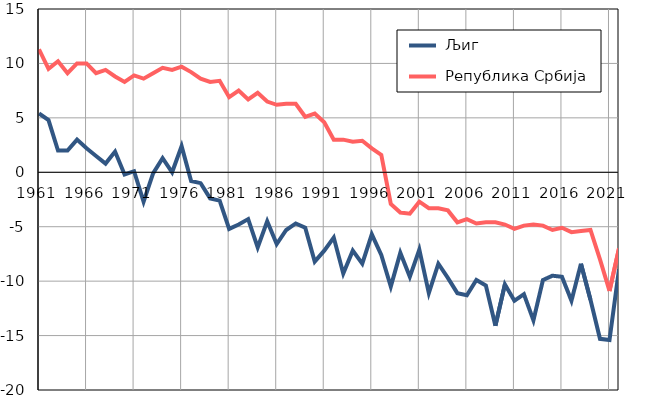
| Category |  Љиг |  Република Србија |
|---|---|---|
| 1961.0 | 5.4 | 11.3 |
| 1962.0 | 4.8 | 9.5 |
| 1963.0 | 2 | 10.2 |
| 1964.0 | 2 | 9.1 |
| 1965.0 | 3 | 10 |
| 1966.0 | 2.2 | 10 |
| 1967.0 | 1.5 | 9.1 |
| 1968.0 | 0.8 | 9.4 |
| 1969.0 | 1.9 | 8.8 |
| 1970.0 | -0.2 | 8.3 |
| 1971.0 | 0.1 | 8.9 |
| 1972.0 | -2.7 | 8.6 |
| 1973.0 | -0.1 | 9.1 |
| 1974.0 | 1.3 | 9.6 |
| 1975.0 | 0 | 9.4 |
| 1976.0 | 2.4 | 9.7 |
| 1977.0 | -0.8 | 9.2 |
| 1978.0 | -1 | 8.6 |
| 1979.0 | -2.4 | 8.3 |
| 1980.0 | -2.6 | 8.4 |
| 1981.0 | -5.2 | 6.9 |
| 1982.0 | -4.8 | 7.5 |
| 1983.0 | -4.3 | 6.7 |
| 1984.0 | -6.9 | 7.3 |
| 1985.0 | -4.5 | 6.5 |
| 1986.0 | -6.6 | 6.2 |
| 1987.0 | -5.3 | 6.3 |
| 1988.0 | -4.7 | 6.3 |
| 1989.0 | -5.1 | 5.1 |
| 1990.0 | -8.2 | 5.4 |
| 1991.0 | -7.2 | 4.6 |
| 1992.0 | -6 | 3 |
| 1993.0 | -9.3 | 3 |
| 1994.0 | -7.2 | 2.8 |
| 1995.0 | -8.4 | 2.9 |
| 1996.0 | -5.7 | 2.2 |
| 1997.0 | -7.6 | 1.6 |
| 1998.0 | -10.5 | -2.9 |
| 1999.0 | -7.4 | -3.7 |
| 2000.0 | -9.6 | -3.8 |
| 2001.0 | -7.1 | -2.7 |
| 2002.0 | -11.1 | -3.3 |
| 2003.0 | -8.4 | -3.3 |
| 2004.0 | -9.7 | -3.5 |
| 2005.0 | -11.1 | -4.6 |
| 2006.0 | -11.3 | -4.3 |
| 2007.0 | -9.9 | -4.7 |
| 2008.0 | -10.4 | -4.6 |
| 2009.0 | -14.1 | -4.6 |
| 2010.0 | -10.3 | -4.8 |
| 2011.0 | -11.8 | -5.2 |
| 2012.0 | -11.2 | -4.9 |
| 2013.0 | -13.6 | -4.8 |
| 2014.0 | -9.9 | -4.9 |
| 2015.0 | -9.5 | -5.3 |
| 2016.0 | -9.6 | -5.1 |
| 2017.0 | -11.8 | -5.5 |
| 2018.0 | -8.4 | -5.4 |
| 2019.0 | -11.7 | -5.3 |
| 2020.0 | -15.3 | -8 |
| 2021.0 | -15.4 | -10.9 |
| 2022.0 | -8.9 | -7 |